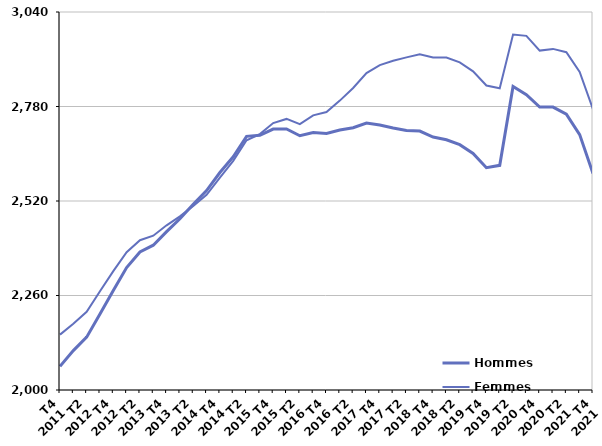
| Category | Hommes  | Femmes  |
|---|---|---|
| T4
2011 | 2065.3 | 2152.3 |
| T1
2012 | 2108.3 | 2182 |
| T2
2012 | 2145.4 | 2215.3 |
| T3
2012 | 2209.1 | 2271.7 |
| T4
2012 | 2273.8 | 2327.1 |
| T1
2013 | 2337 | 2379.3 |
| T2
2013 | 2379.7 | 2412.2 |
| T3
2013 | 2398.4 | 2424.5 |
| T4
2013 | 2435.6 | 2453.1 |
| T1
2014 | 2471.2 | 2477.6 |
| T2
2014 | 2511 | 2506 |
| T3
2014 | 2548.5 | 2537.2 |
| T4
2014 | 2598.4 | 2584.4 |
| T1
2015 | 2641.7 | 2630.5 |
| T2
2015 | 2697.8 | 2687 |
| T3
2015 | 2700.7 | 2704.1 |
| T4
2015 | 2718 | 2734.5 |
| T1
2016 | 2718.2 | 2745.8 |
| T2
2016 | 2699.5 | 2731.3 |
| T3
2016 | 2708.6 | 2755.7 |
| T4
2016 | 2705.6 | 2764.8 |
| T1
2017 | 2715.1 | 2796.2 |
| T2
2017 | 2721.7 | 2830.9 |
| T3
2017 | 2734.7 | 2871.9 |
| T4
2017 | 2729 | 2893.8 |
| T1
2018 | 2720.8 | 2905.8 |
| T2
2018 | 2714.2 | 2915.2 |
| T3
2018 | 2712.5 | 2923.6 |
| T4
2018 | 2695.9 | 2914.8 |
| T1
2019 | 2688.5 | 2914.6 |
| T2
2019 | 2674.9 | 2901.4 |
| T3
2019 | 2650.7 | 2876.7 |
| T4
2019 | 2611.5 | 2837.7 |
| T1
2020 | 2618.1 | 2830.1 |
| T2
2020 | 2835.1 | 2978.2 |
| T3
2020 | 2812.7 | 2974.4 |
| T4
2020 | 2778.4 | 2933.8 |
| T1
2021 | 2778.4 | 2938.5 |
| T2
2021 | 2759.2 | 2929.5 |
| T3
2021 | 2702.8 | 2875 |
| T4
2021 | 2595.8 | 2772.5 |